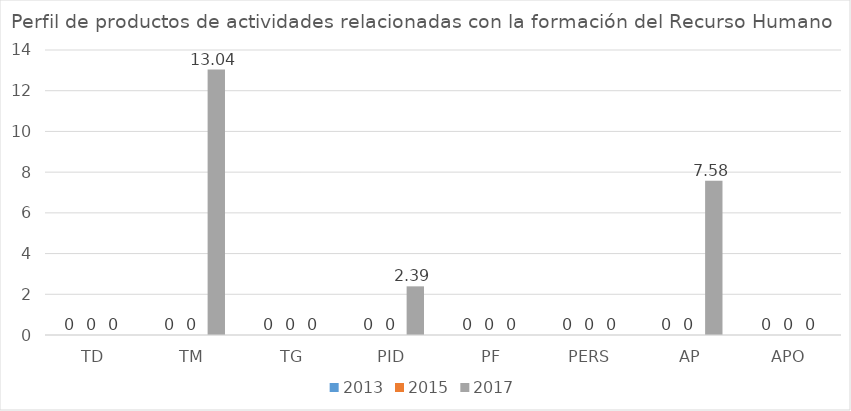
| Category | 2013 | 2015 | 2017 |
|---|---|---|---|
| TD | 0 | 0 | 0 |
| TM | 0 | 0 | 13.04 |
| TG | 0 | 0 | 0 |
| PID | 0 | 0 | 2.39 |
| PF | 0 | 0 | 0 |
| PERS | 0 | 0 | 0 |
| AP | 0 | 0 | 7.58 |
| APO | 0 | 0 | 0 |